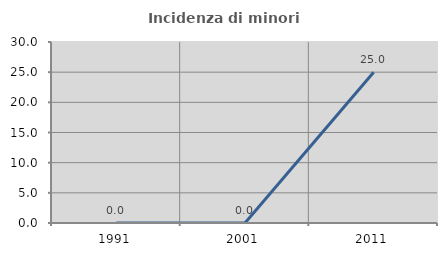
| Category | Incidenza di minori stranieri |
|---|---|
| 1991.0 | 0 |
| 2001.0 | 0 |
| 2011.0 | 25 |